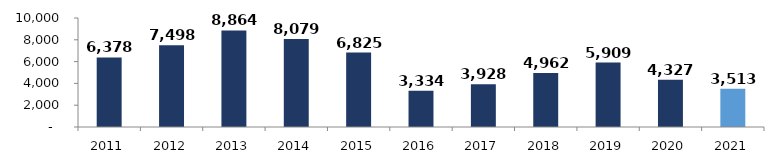
| Category | Series 0 |
|---|---|
| 2011.0 | 6377.615 |
| 2012.0 | 7498.207 |
| 2013.0 | 8863.622 |
| 2014.0 | 8079.21 |
| 2015.0 | 6824.624 |
| 2016.0 | 3333.564 |
| 2017.0 | 3928.017 |
| 2018.0 | 4961.838 |
| 2019.0 | 5908.679 |
| 2020.0 | 4327.23 |
| 2021.0 | 3513.287 |